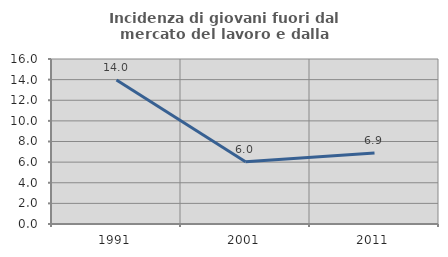
| Category | Incidenza di giovani fuori dal mercato del lavoro e dalla formazione  |
|---|---|
| 1991.0 | 13.953 |
| 2001.0 | 6.047 |
| 2011.0 | 6.897 |